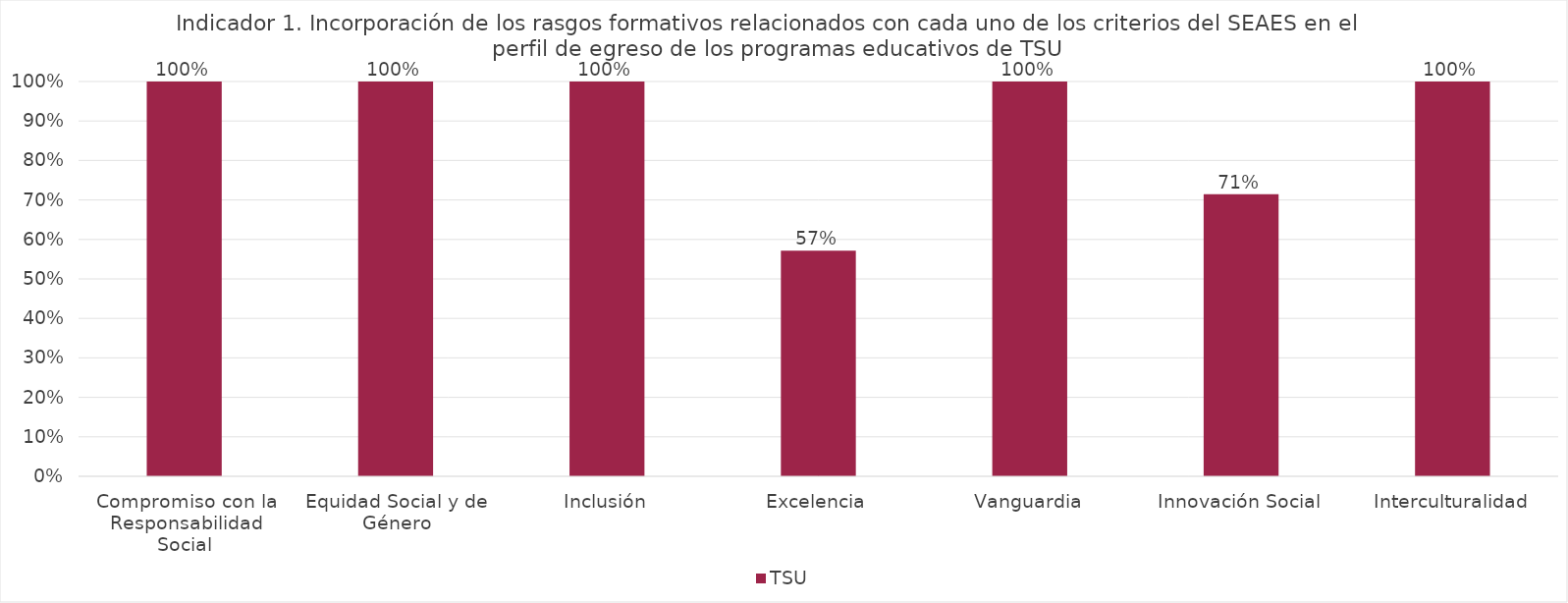
| Category | TSU |
|---|---|
| Compromiso con la Responsabilidad Social | 1 |
| Equidad Social y de Género | 1 |
| Inclusión | 1 |
| Excelencia | 0.571 |
| Vanguardia | 1 |
| Innovación Social | 0.714 |
| Interculturalidad | 1 |